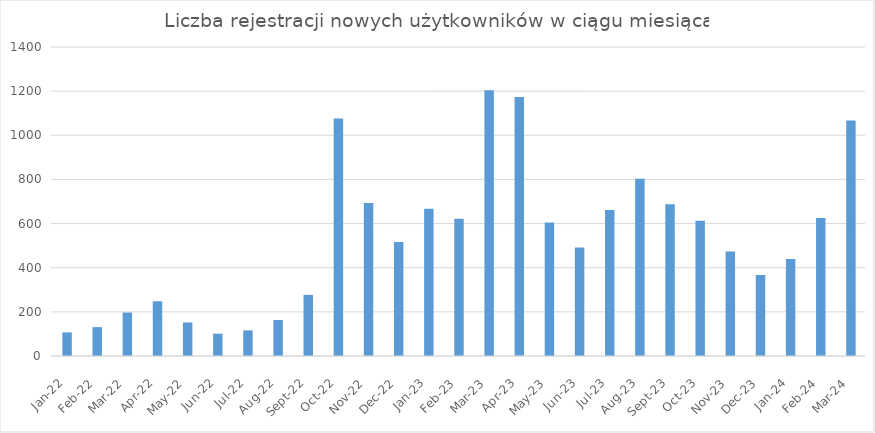
| Category | Series 0 |
|---|---|
| 2022-01-01 | 107 |
| 2022-02-01 | 131 |
| 2022-03-01 | 197 |
| 2022-04-01 | 248 |
| 2022-05-01 | 152 |
| 2022-06-01 | 101 |
| 2022-07-01 | 116 |
| 2022-08-01 | 163 |
| 2022-09-01 | 277 |
| 2022-10-01 | 1076 |
| 2022-11-01 | 693 |
| 2022-12-01 | 517 |
| 2023-01-01 | 667 |
| 2023-02-01 | 622 |
| 2023-03-01 | 1204 |
| 2023-04-01 | 1173 |
| 2023-05-01 | 605 |
| 2023-06-01 | 492 |
| 2023-07-01 | 662 |
| 2023-08-01 | 803 |
| 2023-09-01 | 688 |
| 2023-10-01 | 613 |
| 2023-11-01 | 473 |
| 2023-12-01 | 367 |
| 2024-01-01 | 439 |
| 2024-02-01 | 625 |
| 2024-03-01 | 1067 |